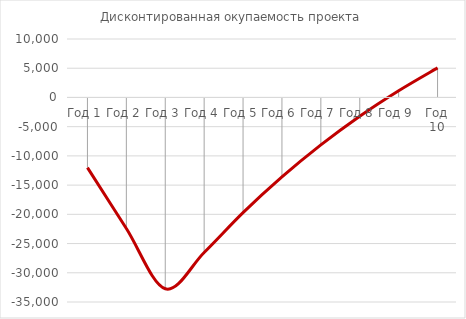
| Category | Дисконтированная окупаемость проекта |
|---|---|
| Год 1 | -12000 |
| Год 2 | -22434.783 |
| Год 3 | -32734.247 |
| Год 4 | -26529.942 |
| Год 5 | -19714.192 |
| Год 6 | -13602.471 |
| Год 7 | -8122.639 |
| Год 8 | -3209.88 |
| Год 9 | 1150.448 |
| Год 10 | 5060.234 |